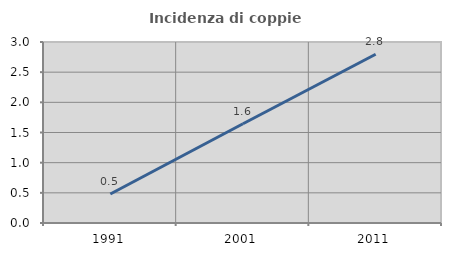
| Category | Incidenza di coppie miste |
|---|---|
| 1991.0 | 0.481 |
| 2001.0 | 1.645 |
| 2011.0 | 2.797 |